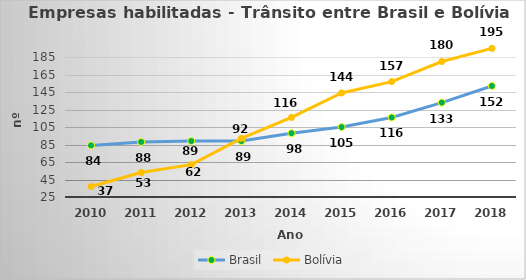
| Category | Brasil | Bolívia |
|---|---|---|
| 2010.0 | 84 | 37 |
| 2011.0 | 88 | 53 |
| 2012.0 | 89 | 62 |
| 2013.0 | 89 | 92 |
| 2014.0 | 98 | 116 |
| 2015.0 | 105 | 144 |
| 2016.0 | 116 | 157 |
| 2017.0 | 133 | 180 |
| 2018.0 | 152 | 195 |